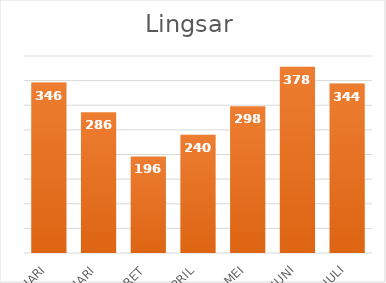
| Category |  346  |
|---|---|
| JANUARI | 346 |
| PEBRUARI | 286 |
| MARET | 196 |
| APRIL | 240 |
| MEI | 298 |
| JUNI | 378 |
| JULI | 344 |